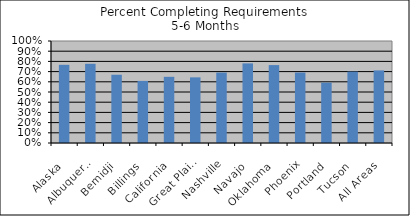
| Category | % Comp. Req. |
|---|---|
| Alaska | 0.766 |
| Albuquerque | 0.777 |
| Bemidji | 0.669 |
| Billings | 0.609 |
| California | 0.649 |
| Great Plains | 0.644 |
| Nashville | 0.69 |
| Navajo | 0.781 |
| Oklahoma | 0.764 |
| Phoenix | 0.691 |
| Portland | 0.591 |
| Tucson | 0.7 |
| All Areas | 0.712 |